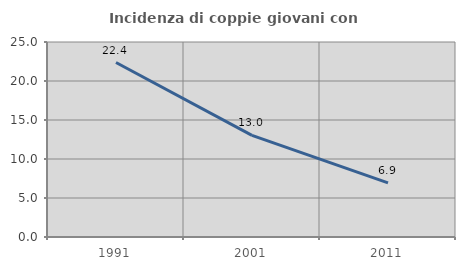
| Category | Incidenza di coppie giovani con figli |
|---|---|
| 1991.0 | 22.368 |
| 2001.0 | 13.028 |
| 2011.0 | 6.939 |